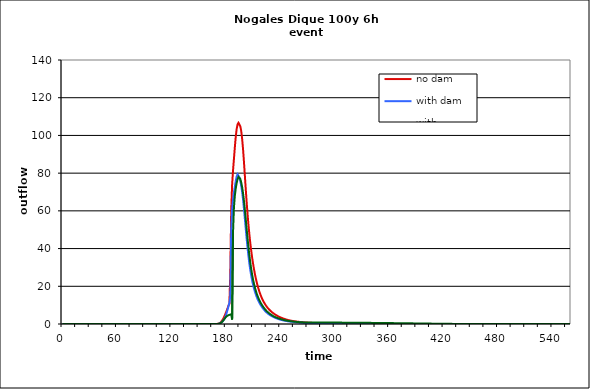
| Category | no dam | with dam | with dam/pond |
|---|---|---|---|
| 0.0 | 0 | 0 | 0 |
| 1.0 | 0 | 0 | 0 |
| 2.0 | 0 | 0 | 0 |
| 3.0 | 0 | 0 | 0 |
| 4.0 | 0 | 0 | 0 |
| 5.0 | 0 | 0 | 0 |
| 6.0 | 0 | 0 | 0 |
| 7.0 | 0 | 0 | 0 |
| 8.0 | 0 | 0 | 0 |
| 9.0 | 0 | 0 | 0 |
| 10.0 | 0 | 0 | 0 |
| 11.0 | 0 | 0 | 0 |
| 12.0 | 0 | 0 | 0 |
| 13.0 | 0 | 0 | 0 |
| 14.0 | 0 | 0 | 0 |
| 15.0 | 0 | 0 | 0 |
| 16.0 | 0 | 0 | 0 |
| 17.0 | 0 | 0 | 0 |
| 18.0 | 0 | 0 | 0 |
| 19.0 | 0 | 0 | 0 |
| 20.0 | 0 | 0 | 0 |
| 21.0 | 0 | 0 | 0 |
| 22.0 | 0 | 0 | 0 |
| 23.0 | 0 | 0 | 0 |
| 24.0 | 0 | 0 | 0 |
| 25.0 | 0 | 0 | 0 |
| 26.0 | 0 | 0 | 0 |
| 27.0 | 0 | 0 | 0 |
| 28.0 | 0 | 0 | 0 |
| 29.0 | 0 | 0 | 0 |
| 30.0 | 0 | 0 | 0 |
| 31.0 | 0 | 0 | 0 |
| 32.0 | 0 | 0 | 0 |
| 33.0 | 0 | 0 | 0 |
| 34.0 | 0 | 0 | 0 |
| 35.0 | 0 | 0 | 0 |
| 36.0 | 0 | 0 | 0 |
| 37.0 | 0 | 0 | 0 |
| 38.0 | 0 | 0 | 0 |
| 39.0 | 0 | 0 | 0 |
| 40.0 | 0 | 0 | 0 |
| 41.0 | 0 | 0 | 0 |
| 42.0 | 0 | 0 | 0 |
| 43.0 | 0 | 0 | 0 |
| 44.0 | 0 | 0 | 0 |
| 45.0 | 0 | 0 | 0 |
| 46.0 | 0 | 0 | 0 |
| 47.0 | 0 | 0 | 0 |
| 48.0 | 0 | 0 | 0 |
| 49.0 | 0 | 0 | 0 |
| 50.0 | 0 | 0 | 0 |
| 51.0 | 0 | 0 | 0 |
| 52.0 | 0 | 0 | 0 |
| 53.0 | 0 | 0 | 0 |
| 54.0 | 0 | 0 | 0 |
| 55.0 | 0 | 0 | 0 |
| 56.0 | 0 | 0 | 0 |
| 57.0 | 0 | 0 | 0 |
| 58.0 | 0 | 0 | 0 |
| 59.0 | 0 | 0 | 0 |
| 60.0 | 0 | 0 | 0 |
| 61.0 | 0 | 0 | 0 |
| 62.0 | 0 | 0 | 0 |
| 63.0 | 0 | 0 | 0 |
| 64.0 | 0 | 0 | 0 |
| 65.0 | 0 | 0 | 0 |
| 66.0 | 0 | 0 | 0 |
| 67.0 | 0 | 0 | 0 |
| 68.0 | 0 | 0 | 0 |
| 69.0 | 0 | 0 | 0 |
| 70.0 | 0 | 0 | 0 |
| 71.0 | 0 | 0 | 0 |
| 72.0 | 0 | 0 | 0 |
| 73.0 | 0 | 0 | 0 |
| 74.0 | 0 | 0 | 0 |
| 75.0 | 0 | 0 | 0 |
| 76.0 | 0 | 0 | 0 |
| 77.0 | 0 | 0 | 0 |
| 78.0 | 0 | 0 | 0 |
| 79.0 | 0 | 0 | 0 |
| 80.0 | 0 | 0 | 0 |
| 81.0 | 0 | 0 | 0 |
| 82.0 | 0 | 0 | 0 |
| 83.0 | 0 | 0 | 0 |
| 84.0 | 0 | 0 | 0 |
| 85.0 | 0 | 0 | 0 |
| 86.0 | 0 | 0 | 0 |
| 87.0 | 0 | 0 | 0 |
| 88.0 | 0 | 0 | 0 |
| 89.0 | 0 | 0 | 0 |
| 90.0 | 0 | 0 | 0 |
| 91.0 | 0 | 0 | 0 |
| 92.0 | 0 | 0 | 0 |
| 93.0 | 0 | 0 | 0 |
| 94.0 | 0 | 0 | 0 |
| 95.0 | 0 | 0 | 0 |
| 96.0 | 0 | 0 | 0 |
| 97.0 | 0 | 0 | 0 |
| 98.0 | 0 | 0 | 0 |
| 99.0 | 0 | 0 | 0 |
| 100.0 | 0 | 0 | 0 |
| 101.0 | 0 | 0 | 0 |
| 102.0 | 0 | 0 | 0 |
| 103.0 | 0 | 0 | 0 |
| 104.0 | 0 | 0 | 0 |
| 105.0 | 0 | 0 | 0 |
| 106.0 | 0 | 0 | 0 |
| 107.0 | 0 | 0 | 0 |
| 108.0 | 0 | 0 | 0 |
| 109.0 | 0 | 0 | 0 |
| 110.0 | 0 | 0 | 0 |
| 111.0 | 0 | 0 | 0 |
| 112.0 | 0 | 0 | 0 |
| 113.0 | 0 | 0 | 0 |
| 114.0 | 0 | 0 | 0 |
| 115.0 | 0 | 0 | 0 |
| 116.0 | 0 | 0 | 0 |
| 117.0 | 0 | 0 | 0 |
| 118.0 | 0 | 0 | 0 |
| 119.0 | 0 | 0 | 0 |
| 120.0 | 0 | 0 | 0 |
| 121.0 | 0 | 0 | 0 |
| 122.0 | 0 | 0 | 0 |
| 123.0 | 0 | 0 | 0 |
| 124.0 | 0 | 0 | 0 |
| 125.0 | 0 | 0 | 0 |
| 126.0 | 0 | 0 | 0 |
| 127.0 | 0 | 0 | 0 |
| 128.0 | 0 | 0 | 0 |
| 129.0 | 0 | 0 | 0 |
| 130.0 | 0 | 0 | 0 |
| 131.0 | 0 | 0 | 0 |
| 132.0 | 0 | 0 | 0 |
| 133.0 | 0 | 0 | 0 |
| 134.0 | 0 | 0 | 0 |
| 135.0 | 0 | 0 | 0 |
| 136.0 | 0 | 0 | 0 |
| 137.0 | 0 | 0 | 0 |
| 138.0 | 0 | 0 | 0 |
| 139.0 | 0 | 0 | 0 |
| 140.0 | 0 | 0 | 0 |
| 141.0 | 0 | 0 | 0 |
| 142.0 | 0 | 0 | 0 |
| 143.0 | 0 | 0 | 0 |
| 144.0 | 0 | 0 | 0 |
| 145.0 | 0 | 0 | 0 |
| 146.0 | 0 | 0 | 0 |
| 147.0 | 0 | 0 | 0 |
| 148.0 | 0 | 0 | 0 |
| 149.0 | 0 | 0 | 0 |
| 150.0 | 0 | 0 | 0 |
| 151.0 | 0 | 0 | 0 |
| 152.0 | 0 | 0 | 0 |
| 153.0 | 0 | 0 | 0 |
| 154.0 | 0 | 0 | 0 |
| 155.0 | 0 | 0 | 0 |
| 156.0 | 0 | 0 | 0 |
| 157.0 | 0 | 0 | 0 |
| 158.0 | 0 | 0 | 0 |
| 159.0 | 0 | 0 | 0 |
| 160.0 | 0 | 0 | 0 |
| 161.0 | 0 | 0 | 0 |
| 162.0 | 0.001 | 0 | 0 |
| 163.0 | 0.001 | 0 | 0 |
| 164.0 | 0.003 | 0.001 | 0.001 |
| 165.0 | 0.005 | 0.002 | 0.002 |
| 166.0 | 0.009 | 0.003 | 0.003 |
| 167.0 | 0.015 | 0.005 | 0.005 |
| 168.0 | 0.023 | 0.008 | 0.008 |
| 169.0 | 0.032 | 0.013 | 0.013 |
| 170.0 | 0.044 | 0.019 | 0.019 |
| 171.0 | 0.074 | 0.036 | 0.036 |
| 172.0 | 0.153 | 0.087 | 0.087 |
| 173.0 | 0.325 | 0.206 | 0.205 |
| 174.0 | 0.645 | 0.418 | 0.416 |
| 175.0 | 1.152 | 0.735 | 0.732 |
| 176.0 | 1.831 | 1.169 | 1.166 |
| 177.0 | 2.637 | 1.71 | 1.706 |
| 178.0 | 3.57 | 2.342 | 2.327 |
| 179.0 | 4.62 | 3.182 | 3.01 |
| 180.0 | 5.78 | 4.393 | 3.644 |
| 181.0 | 7.038 | 5.946 | 4.123 |
| 182.0 | 8.395 | 7.631 | 4.452 |
| 183.0 | 9.834 | 9.449 | 4.673 |
| 184.0 | 10.677 | 11.3 | 4.837 |
| 185.0 | 26.603 | 14.708 | 4.974 |
| 186.0 | 60.482 | 48.962 | 5.142 |
| 187.0 | 73.835 | 60.591 | 2.352 |
| 188.0 | 81.399 | 65.972 | 48.653 |
| 189.0 | 87.57 | 69.634 | 61.809 |
| 190.0 | 93.695 | 72.862 | 68.011 |
| 191.0 | 99.304 | 75.863 | 71.978 |
| 192.0 | 103.432 | 78.188 | 74.731 |
| 193.0 | 105.874 | 79.392 | 76.783 |
| 194.0 | 106.7 | 79.238 | 78.008 |
| 195.0 | 106.264 | 77.838 | 78.015 |
| 196.0 | 104.908 | 75.877 | 76.94 |
| 197.0 | 102.422 | 73.388 | 75.144 |
| 198.0 | 98.447 | 70.173 | 72.697 |
| 199.0 | 92.978 | 66.111 | 69.499 |
| 200.0 | 86.319 | 61.298 | 65.486 |
| 201.0 | 79.034 | 55.995 | 60.84 |
| 202.0 | 71.683 | 50.558 | 55.722 |
| 203.0 | 64.701 | 45.275 | 50.507 |
| 204.0 | 58.317 | 40.383 | 45.469 |
| 205.0 | 52.615 | 35.986 | 40.724 |
| 206.0 | 47.544 | 32.106 | 36.431 |
| 207.0 | 43.04 | 28.714 | 32.646 |
| 208.0 | 39.031 | 25.766 | 29.285 |
| 209.0 | 35.449 | 23.201 | 26.335 |
| 210.0 | 32.242 | 20.975 | 23.777 |
| 211.0 | 29.367 | 19.028 | 21.507 |
| 212.0 | 26.78 | 17.318 | 19.551 |
| 213.0 | 24.456 | 15.809 | 17.821 |
| 214.0 | 22.365 | 14.474 | 16.265 |
| 215.0 | 20.48 | 13.291 | 14.915 |
| 216.0 | 18.779 | 12.232 | 13.738 |
| 217.0 | 17.245 | 11.28 | 12.637 |
| 218.0 | 15.861 | 10.418 | 11.637 |
| 219.0 | 14.612 | 9.631 | 10.765 |
| 220.0 | 13.491 | 8.91 | 9.99 |
| 221.0 | 12.478 | 8.25 | 9.284 |
| 222.0 | 11.562 | 7.645 | 8.606 |
| 223.0 | 10.732 | 7.091 | 7.956 |
| 224.0 | 9.979 | 6.583 | 7.373 |
| 225.0 | 9.294 | 6.119 | 6.86 |
| 226.0 | 8.67 | 5.695 | 6.402 |
| 227.0 | 8.099 | 5.309 | 5.988 |
| 228.0 | 7.574 | 4.957 | 5.611 |
| 229.0 | 7.091 | 4.635 | 5.261 |
| 230.0 | 6.644 | 4.341 | 4.909 |
| 231.0 | 6.23 | 4.07 | 4.575 |
| 232.0 | 5.845 | 3.819 | 4.278 |
| 233.0 | 5.487 | 3.587 | 4.015 |
| 234.0 | 5.153 | 3.37 | 3.778 |
| 235.0 | 4.842 | 3.168 | 3.561 |
| 236.0 | 4.551 | 2.978 | 3.36 |
| 237.0 | 4.279 | 2.799 | 3.174 |
| 238.0 | 4.025 | 2.631 | 2.999 |
| 239.0 | 3.786 | 2.473 | 2.835 |
| 240.0 | 3.563 | 2.324 | 2.681 |
| 241.0 | 3.353 | 2.185 | 2.536 |
| 242.0 | 3.156 | 2.056 | 2.399 |
| 243.0 | 2.97 | 1.94 | 2.266 |
| 244.0 | 2.795 | 1.834 | 2.136 |
| 245.0 | 2.63 | 1.737 | 2.015 |
| 246.0 | 2.474 | 1.647 | 1.907 |
| 247.0 | 2.328 | 1.564 | 1.81 |
| 248.0 | 2.193 | 1.486 | 1.722 |
| 249.0 | 2.07 | 1.414 | 1.641 |
| 250.0 | 1.956 | 1.346 | 1.566 |
| 251.0 | 1.85 | 1.282 | 1.496 |
| 252.0 | 1.752 | 1.222 | 1.431 |
| 253.0 | 1.66 | 1.165 | 1.369 |
| 254.0 | 1.575 | 1.111 | 1.311 |
| 255.0 | 1.495 | 1.06 | 1.256 |
| 256.0 | 1.421 | 1.011 | 1.204 |
| 257.0 | 1.352 | 0.964 | 1.155 |
| 258.0 | 1.287 | 0.92 | 1.108 |
| 259.0 | 1.226 | 0.879 | 1.064 |
| 260.0 | 1.169 | 0.839 | 1.022 |
| 261.0 | 1.115 | 0.802 | 0.982 |
| 262.0 | 1.064 | 0.766 | 0.944 |
| 263.0 | 1.016 | 0.732 | 0.909 |
| 264.0 | 0.971 | 0.701 | 0.88 |
| 265.0 | 0.927 | 0.671 | 0.858 |
| 266.0 | 0.886 | 0.643 | 0.843 |
| 267.0 | 0.847 | 0.616 | 0.835 |
| 268.0 | 0.81 | 0.591 | 0.831 |
| 269.0 | 0.775 | 0.567 | 0.828 |
| 270.0 | 0.741 | 0.545 | 0.827 |
| 271.0 | 0.709 | 0.523 | 0.825 |
| 272.0 | 0.679 | 0.503 | 0.824 |
| 273.0 | 0.65 | 0.484 | 0.822 |
| 274.0 | 0.622 | 0.465 | 0.82 |
| 275.0 | 0.596 | 0.448 | 0.819 |
| 276.0 | 0.571 | 0.431 | 0.817 |
| 277.0 | 0.547 | 0.415 | 0.815 |
| 278.0 | 0.525 | 0.4 | 0.813 |
| 279.0 | 0.503 | 0.385 | 0.811 |
| 280.0 | 0.483 | 0.371 | 0.809 |
| 281.0 | 0.464 | 0.358 | 0.806 |
| 282.0 | 0.445 | 0.345 | 0.804 |
| 283.0 | 0.428 | 0.333 | 0.802 |
| 284.0 | 0.411 | 0.321 | 0.799 |
| 285.0 | 0.395 | 0.31 | 0.797 |
| 286.0 | 0.38 | 0.299 | 0.795 |
| 287.0 | 0.365 | 0.289 | 0.792 |
| 288.0 | 0.352 | 0.279 | 0.789 |
| 289.0 | 0.338 | 0.27 | 0.787 |
| 290.0 | 0.326 | 0.261 | 0.784 |
| 291.0 | 0.313 | 0.253 | 0.781 |
| 292.0 | 0.302 | 0.244 | 0.779 |
| 293.0 | 0.29 | 0.237 | 0.776 |
| 294.0 | 0.28 | 0.229 | 0.773 |
| 295.0 | 0.27 | 0.222 | 0.77 |
| 296.0 | 0.26 | 0.215 | 0.767 |
| 297.0 | 0.25 | 0.208 | 0.764 |
| 298.0 | 0.241 | 0.202 | 0.761 |
| 299.0 | 0.233 | 0.196 | 0.758 |
| 300.0 | 0.224 | 0.19 | 0.755 |
| 301.0 | 0.216 | 0.184 | 0.752 |
| 302.0 | 0.209 | 0.178 | 0.749 |
| 303.0 | 0.201 | 0.173 | 0.745 |
| 304.0 | 0.194 | 0.168 | 0.742 |
| 305.0 | 0.187 | 0.162 | 0.739 |
| 306.0 | 0.181 | 0.158 | 0.736 |
| 307.0 | 0.175 | 0.153 | 0.732 |
| 308.0 | 0.169 | 0.148 | 0.729 |
| 309.0 | 0.163 | 0.144 | 0.726 |
| 310.0 | 0.157 | 0.14 | 0.722 |
| 311.0 | 0.152 | 0.136 | 0.719 |
| 312.0 | 0.147 | 0.132 | 0.715 |
| 313.0 | 0.142 | 0.128 | 0.712 |
| 314.0 | 0.137 | 0.124 | 0.708 |
| 315.0 | 0.132 | 0.121 | 0.705 |
| 316.0 | 0.128 | 0.117 | 0.701 |
| 317.0 | 0.124 | 0.114 | 0.697 |
| 318.0 | 0.12 | 0.111 | 0.694 |
| 319.0 | 0.116 | 0.108 | 0.69 |
| 320.0 | 0.112 | 0.105 | 0.686 |
| 321.0 | 0.108 | 0.102 | 0.682 |
| 322.0 | 0.105 | 0.099 | 0.679 |
| 323.0 | 0.101 | 0.096 | 0.675 |
| 324.0 | 0.098 | 0.094 | 0.671 |
| 325.0 | 0.095 | 0.091 | 0.667 |
| 326.0 | 0.092 | 0.088 | 0.663 |
| 327.0 | 0.089 | 0.086 | 0.659 |
| 328.0 | 0.086 | 0.084 | 0.655 |
| 329.0 | 0.083 | 0.081 | 0.65 |
| 330.0 | 0.08 | 0.079 | 0.646 |
| 331.0 | 0.078 | 0.077 | 0.641 |
| 332.0 | 0.075 | 0.075 | 0.636 |
| 333.0 | 0.073 | 0.073 | 0.631 |
| 334.0 | 0.071 | 0.071 | 0.626 |
| 335.0 | 0.068 | 0.069 | 0.622 |
| 336.0 | 0.066 | 0.067 | 0.617 |
| 337.0 | 0.064 | 0.065 | 0.612 |
| 338.0 | 0.062 | 0.064 | 0.607 |
| 339.0 | 0.06 | 0.062 | 0.602 |
| 340.0 | 0.058 | 0.06 | 0.597 |
| 341.0 | 0.056 | 0.059 | 0.592 |
| 342.0 | 0.055 | 0.057 | 0.587 |
| 343.0 | 0.053 | 0.056 | 0.582 |
| 344.0 | 0.052 | 0.054 | 0.577 |
| 345.0 | 0.05 | 0.053 | 0.572 |
| 346.0 | 0.048 | 0.051 | 0.567 |
| 347.0 | 0.047 | 0.05 | 0.561 |
| 348.0 | 0.046 | 0.049 | 0.556 |
| 349.0 | 0.044 | 0.047 | 0.551 |
| 350.0 | 0.043 | 0.046 | 0.546 |
| 351.0 | 0.042 | 0.045 | 0.541 |
| 352.0 | 0.04 | 0.044 | 0.535 |
| 353.0 | 0.039 | 0.043 | 0.53 |
| 354.0 | 0.038 | 0.042 | 0.525 |
| 355.0 | 0.037 | 0.041 | 0.519 |
| 356.0 | 0.036 | 0.04 | 0.514 |
| 357.0 | 0.035 | 0.039 | 0.509 |
| 358.0 | 0.034 | 0.038 | 0.503 |
| 359.0 | 0.033 | 0.037 | 0.498 |
| 360.0 | 0.032 | 0.036 | 0.492 |
| 361.0 | 0.031 | 0.035 | 0.487 |
| 362.0 | 0.03 | 0.034 | 0.481 |
| 363.0 | 0.029 | 0.033 | 0.475 |
| 364.0 | 0.028 | 0.032 | 0.469 |
| 365.0 | 0.027 | 0.032 | 0.464 |
| 366.0 | 0.026 | 0.031 | 0.458 |
| 367.0 | 0.026 | 0.03 | 0.451 |
| 368.0 | 0.025 | 0.029 | 0.445 |
| 369.0 | 0.024 | 0.029 | 0.439 |
| 370.0 | 0.024 | 0.028 | 0.433 |
| 371.0 | 0.023 | 0.027 | 0.427 |
| 372.0 | 0.022 | 0.026 | 0.421 |
| 373.0 | 0.022 | 0.026 | 0.415 |
| 374.0 | 0.021 | 0.025 | 0.409 |
| 375.0 | 0.02 | 0.025 | 0.403 |
| 376.0 | 0.02 | 0.024 | 0.396 |
| 377.0 | 0.019 | 0.023 | 0.39 |
| 378.0 | 0.019 | 0.023 | 0.384 |
| 379.0 | 0.018 | 0.022 | 0.378 |
| 380.0 | 0.018 | 0.022 | 0.372 |
| 381.0 | 0.017 | 0.021 | 0.365 |
| 382.0 | 0.016 | 0.021 | 0.359 |
| 383.0 | 0.016 | 0.02 | 0.353 |
| 384.0 | 0.016 | 0.02 | 0.347 |
| 385.0 | 0.015 | 0.019 | 0.34 |
| 386.0 | 0.015 | 0.019 | 0.334 |
| 387.0 | 0.014 | 0.018 | 0.328 |
| 388.0 | 0.014 | 0.018 | 0.321 |
| 389.0 | 0.013 | 0.018 | 0.315 |
| 390.0 | 0.013 | 0.017 | 0.309 |
| 391.0 | 0.012 | 0.017 | 0.302 |
| 392.0 | 0.012 | 0.016 | 0.295 |
| 393.0 | 0.012 | 0.016 | 0.288 |
| 394.0 | 0.011 | 0.016 | 0.282 |
| 395.0 | 0.011 | 0.015 | 0.275 |
| 396.0 | 0.01 | 0.015 | 0.268 |
| 397.0 | 0.01 | 0.015 | 0.261 |
| 398.0 | 0.01 | 0.014 | 0.255 |
| 399.0 | 0.009 | 0.014 | 0.248 |
| 400.0 | 0.009 | 0.014 | 0.242 |
| 401.0 | 0.009 | 0.013 | 0.235 |
| 402.0 | 0.008 | 0.013 | 0.228 |
| 403.0 | 0.008 | 0.013 | 0.222 |
| 404.0 | 0.008 | 0.012 | 0.216 |
| 405.0 | 0.007 | 0.012 | 0.209 |
| 406.0 | 0.007 | 0.012 | 0.203 |
| 407.0 | 0.007 | 0.012 | 0.197 |
| 408.0 | 0.006 | 0.011 | 0.19 |
| 409.0 | 0.006 | 0.011 | 0.184 |
| 410.0 | 0.006 | 0.011 | 0.178 |
| 411.0 | 0.006 | 0.01 | 0.172 |
| 412.0 | 0.005 | 0.01 | 0.165 |
| 413.0 | 0.005 | 0.01 | 0.159 |
| 414.0 | 0.005 | 0.01 | 0.153 |
| 415.0 | 0.004 | 0.009 | 0.146 |
| 416.0 | 0.004 | 0.009 | 0.139 |
| 417.0 | 0.004 | 0.009 | 0.132 |
| 418.0 | 0.004 | 0.009 | 0.126 |
| 419.0 | 0.004 | 0.009 | 0.119 |
| 420.0 | 0.003 | 0.008 | 0.112 |
| 421.0 | 0.003 | 0.008 | 0.106 |
| 422.0 | 0.003 | 0.008 | 0.1 |
| 423.0 | 0.003 | 0.008 | 0.094 |
| 424.0 | 0.002 | 0.007 | 0.089 |
| 425.0 | 0.002 | 0.007 | 0.084 |
| 426.0 | 0.002 | 0.007 | 0.079 |
| 427.0 | 0.002 | 0.007 | 0.075 |
| 428.0 | 0.002 | 0.007 | 0.071 |
| 429.0 | 0.002 | 0.007 | 0.067 |
| 430.0 | 0.002 | 0.006 | 0.063 |
| 431.0 | 0.001 | 0.006 | 0.06 |
| 432.0 | 0.001 | 0.006 | 0.056 |
| 433.0 | 0.001 | 0.006 | 0.053 |
| 434.0 | 0.001 | 0.006 | 0.051 |
| 435.0 | 0.001 | 0.006 | 0.048 |
| 436.0 | 0.001 | 0.005 | 0.045 |
| 437.0 | 0.001 | 0.005 | 0.043 |
| 438.0 | 0.001 | 0.005 | 0.041 |
| 439.0 | 0.001 | 0.005 | 0.039 |
| 440.0 | 0.001 | 0.005 | 0.037 |
| 441.0 | 0 | 0.005 | 0.035 |
| 442.0 | 0 | 0.005 | 0.033 |
| 443.0 | 0 | 0.004 | 0.032 |
| 444.0 | 0 | 0.004 | 0.03 |
| 445.0 | 0 | 0.004 | 0.029 |
| 446.0 | 0 | 0.004 | 0.028 |
| 447.0 | 0 | 0.004 | 0.026 |
| 448.0 | 0 | 0.004 | 0.025 |
| 449.0 | 0 | 0.004 | 0.024 |
| 450.0 | 0 | 0.004 | 0.023 |
| 451.0 | 0 | 0.004 | 0.022 |
| 452.0 | 0 | 0.003 | 0.021 |
| 453.0 | 0 | 0.003 | 0.02 |
| 454.0 | 0 | 0.003 | 0.019 |
| 455.0 | 0 | 0.003 | 0.019 |
| 456.0 | 0 | 0.003 | 0.018 |
| 457.0 | 0 | 0.003 | 0.017 |
| 458.0 | 0 | 0.003 | 0.016 |
| 459.0 | 0 | 0.003 | 0.016 |
| 460.0 | 0 | 0.003 | 0.015 |
| 461.0 | 0 | 0.003 | 0.015 |
| 462.0 | 0 | 0.003 | 0.014 |
| 463.0 | 0 | 0.003 | 0.014 |
| 464.0 | 0 | 0.002 | 0.013 |
| 465.0 | 0 | 0.002 | 0.013 |
| 466.0 | 0 | 0.002 | 0.012 |
| 467.0 | 0 | 0.002 | 0.012 |
| 468.0 | 0 | 0.002 | 0.011 |
| 469.0 | 0 | 0.002 | 0.011 |
| 470.0 | 0 | 0.002 | 0.01 |
| 471.0 | 0 | 0.002 | 0.01 |
| 472.0 | 0 | 0.002 | 0.01 |
| 473.0 | 0 | 0.002 | 0.009 |
| 474.0 | 0 | 0.002 | 0.009 |
| 475.0 | 0 | 0.002 | 0.008 |
| 476.0 | 0 | 0.002 | 0.008 |
| 477.0 | 0 | 0.002 | 0.008 |
| 478.0 | 0 | 0.002 | 0.008 |
| 479.0 | 0 | 0.002 | 0.007 |
| 480.0 | 0 | 0.002 | 0.007 |
| 481.0 | 0 | 0.002 | 0.007 |
| 482.0 | 0 | 0.002 | 0.006 |
| 483.0 | 0 | 0.002 | 0.006 |
| 484.0 | 0 | 0.002 | 0.006 |
| 485.0 | 0 | 0.002 | 0.006 |
| 486.0 | 0 | 0.002 | 0.006 |
| 487.0 | 0 | 0.002 | 0.005 |
| 488.0 | 0 | 0.002 | 0.005 |
| 489.0 | 0 | 0.002 | 0.005 |
| 490.0 | 0 | 0.002 | 0.005 |
| 491.0 | 0 | 0.002 | 0.005 |
| 492.0 | 0 | 0.002 | 0.004 |
| 493.0 | 0 | 0.002 | 0.004 |
| 494.0 | 0 | 0.002 | 0.004 |
| 495.0 | 0 | 0.002 | 0.004 |
| 496.0 | 0 | 0.002 | 0.004 |
| 497.0 | 0 | 0.002 | 0.004 |
| 498.0 | 0 | 0.002 | 0.004 |
| 499.0 | 0 | 0.002 | 0.003 |
| 500.0 | 0 | 0.002 | 0.003 |
| 501.0 | 0 | 0.002 | 0.003 |
| 502.0 | 0 | 0.002 | 0.003 |
| 503.0 | 0 | 0.002 | 0.003 |
| 504.0 | 0 | 0.002 | 0.003 |
| 505.0 | 0 | 0.002 | 0.003 |
| 506.0 | 0 | 0.001 | 0.003 |
| 507.0 | 0 | 0.001 | 0.003 |
| 508.0 | 0 | 0.001 | 0.003 |
| 509.0 | 0 | 0.001 | 0.002 |
| 510.0 | 0 | 0.001 | 0.002 |
| 511.0 | 0 | 0.001 | 0.002 |
| 512.0 | 0 | 0.001 | 0.002 |
| 513.0 | 0 | 0.001 | 0.002 |
| 514.0 | 0 | 0.001 | 0.002 |
| 515.0 | 0 | 0.001 | 0.002 |
| 516.0 | 0 | 0.001 | 0.002 |
| 517.0 | 0 | 0.001 | 0.002 |
| 518.0 | 0 | 0.001 | 0.002 |
| 519.0 | 0 | 0.001 | 0.002 |
| 520.0 | 0 | 0.001 | 0.002 |
| 521.0 | 0 | 0.001 | 0.002 |
| 522.0 | 0 | 0.001 | 0.002 |
| 523.0 | 0 | 0.001 | 0.002 |
| 524.0 | 0 | 0.001 | 0.002 |
| 525.0 | 0 | 0.001 | 0.002 |
| 526.0 | 0 | 0.001 | 0.002 |
| 527.0 | 0 | 0.001 | 0.002 |
| 528.0 | 0 | 0.001 | 0.002 |
| 529.0 | 0 | 0.001 | 0.002 |
| 530.0 | 0 | 0.001 | 0.002 |
| 531.0 | 0 | 0.001 | 0.002 |
| 532.0 | 0 | 0.001 | 0.002 |
| 533.0 | 0 | 0.001 | 0.002 |
| 534.0 | 0 | 0.001 | 0.002 |
| 535.0 | 0 | 0.001 | 0.002 |
| 536.0 | 0 | 0.001 | 0.002 |
| 537.0 | 0 | 0.001 | 0.001 |
| 538.0 | 0 | 0.001 | 0.001 |
| 539.0 | 0 | 0.001 | 0.001 |
| 540.0 | 0 | 0.001 | 0.001 |
| 541.0 | 0 | 0.001 | 0.001 |
| 542.0 | 0 | 0.001 | 0.001 |
| 543.0 | 0 | 0.001 | 0.001 |
| 544.0 | 0 | 0.001 | 0.001 |
| 545.0 | 0 | 0.001 | 0.001 |
| 546.0 | 0 | 0.001 | 0.001 |
| 547.0 | 0 | 0.001 | 0.001 |
| 548.0 | 0 | 0.001 | 0.001 |
| 549.0 | 0 | 0.001 | 0.001 |
| 550.0 | 0 | 0.001 | 0.001 |
| 551.0 | 0 | 0.001 | 0.001 |
| 552.0 | 0 | 0.001 | 0.001 |
| 553.0 | 0 | 0.001 | 0.001 |
| 554.0 | 0 | 0.001 | 0.001 |
| 555.0 | 0 | 0.001 | 0.001 |
| 556.0 | 0 | 0.001 | 0.001 |
| 557.0 | 0 | 0.001 | 0.001 |
| 558.0 | 0 | 0.001 | 0.001 |
| 559.0 | 0 | 0.001 | 0.001 |
| 560.0 | 0 | 0.001 | 0.001 |